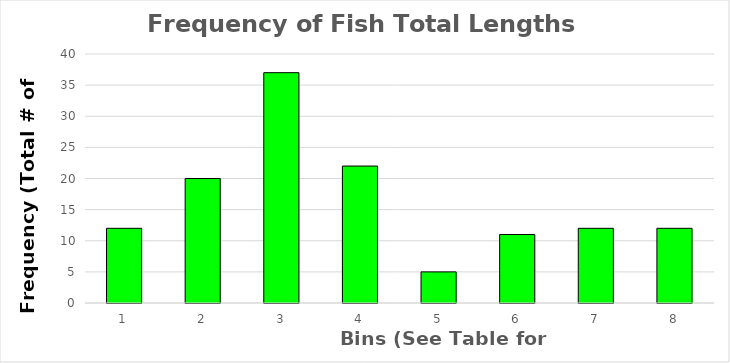
| Category | Series 0 |
|---|---|
| 0 | 12 |
| 1 | 20 |
| 2 | 37 |
| 3 | 22 |
| 4 | 5 |
| 5 | 11 |
| 6 | 12 |
| 7 | 12 |